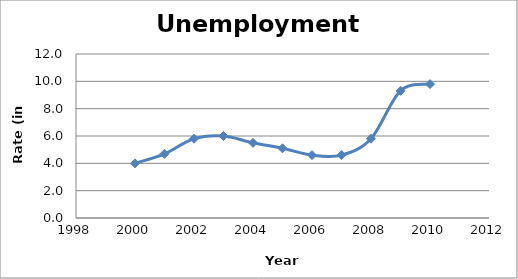
| Category | Series 0 |
|---|---|
| 2000.0 | 4 |
| 2001.0 | 4.7 |
| 2002.0 | 5.8 |
| 2003.0 | 6 |
| 2004.0 | 5.5 |
| 2005.0 | 5.1 |
| 2006.0 | 4.6 |
| 2007.0 | 4.6 |
| 2008.0 | 5.8 |
| 2009.0 | 9.3 |
| 2010.0 | 9.8 |